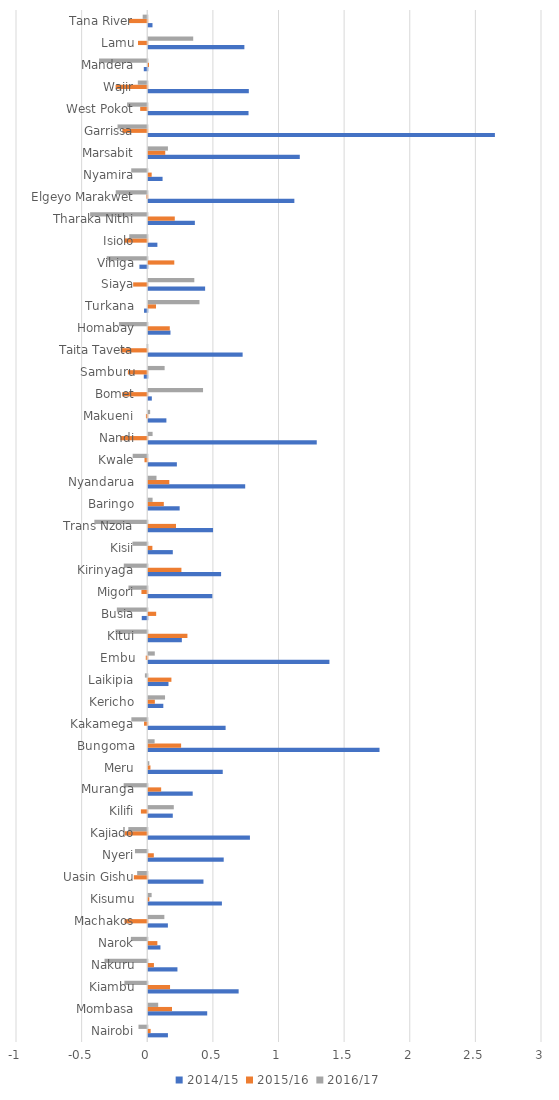
| Category | 2014/15 | 2015/16 | 2016/17 |
|---|---|---|---|
| Nairobi | 0.15 | 0.018 | -0.067 |
| Mombasa | 0.449 | 0.181 | 0.076 |
| Kiambu | 0.689 | 0.166 | -0.174 |
| Nakuru | 0.222 | 0.043 | -0.325 |
| Narok | 0.093 | 0.069 | -0.125 |
| Machakos | 0.15 | -0.173 | 0.123 |
| Kisumu | 0.561 | 0.008 | 0.026 |
| Uasin Gishu | 0.421 | -0.102 | -0.077 |
| Nyeri | 0.575 | 0.042 | -0.094 |
| Kajiado | 0.775 | -0.172 | -0.144 |
| Kilifi | 0.187 | -0.048 | 0.195 |
| Muranga | 0.339 | 0.098 | -0.179 |
| Meru | 0.568 | 0.017 | 0.008 |
| Bungoma | 1.762 | 0.25 | 0.048 |
| Kakamega | 0.589 | -0.024 | -0.121 |
| Kericho | 0.115 | 0.05 | 0.128 |
| Laikipia | 0.154 | 0.176 | -0.018 |
| Embu | 1.38 | -0.011 | 0.05 |
| Kitui | 0.256 | 0.298 | -0.242 |
| Busia | -0.042 | 0.06 | -0.232 |
| Migori | 0.488 | -0.044 | -0.143 |
| Kirinyaga | 0.555 | 0.253 | -0.179 |
| Kisii | 0.187 | 0.032 | -0.113 |
| Trans Nzoia | 0.494 | 0.211 | -0.403 |
| Baringo | 0.239 | 0.119 | 0.033 |
| Nyandarua | 0.739 | 0.16 | 0.063 |
| Kwale | 0.218 | -0.021 | -0.111 |
| Nandi | 1.284 | -0.205 | 0.033 |
| Makueni | 0.138 | -0.01 | 0.014 |
| Bomet | 0.027 | -0.191 | 0.417 |
| Samburu | -0.026 | -0.148 | 0.125 |
| Taita Taveta | 0.719 | -0.202 | -0.004 |
| Homabay | 0.169 | 0.164 | -0.216 |
| Turkana | -0.024 | 0.059 | 0.39 |
| Siaya | 0.433 | -0.107 | 0.351 |
| Vihiga | -0.06 | 0.198 | -0.309 |
| Isiolo | 0.07 | -0.176 | -0.137 |
| Tharaka Nithi | 0.355 | 0.202 | -0.435 |
| Elgeyo Marakwet | 1.113 | -0.007 | -0.24 |
| Nyamira | 0.109 | 0.026 | -0.122 |
| Marsabit | 1.155 | 0.13 | 0.15 |
| Garrissa | 2.641 | -0.19 | -0.226 |
| West Pokot | 0.764 | -0.054 | -0.153 |
| Wajir | 0.766 | -0.241 | -0.072 |
| Mandera | -0.026 | 0.006 | -0.367 |
| Lamu | 0.732 | -0.07 | 0.343 |
| Tana River | 0.032 | -0.14 | -0.035 |